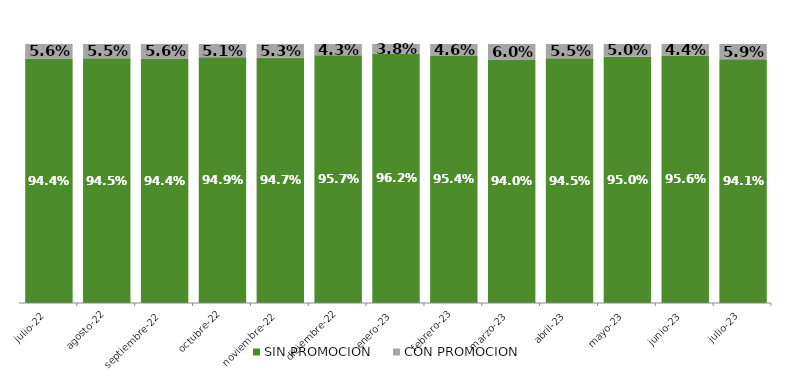
| Category | SIN PROMOCION   | CON PROMOCION   |
|---|---|---|
| 2022-07-01 | 0.944 | 0.056 |
| 2022-08-01 | 0.945 | 0.055 |
| 2022-09-01 | 0.944 | 0.056 |
| 2022-10-01 | 0.949 | 0.051 |
| 2022-11-01 | 0.947 | 0.053 |
| 2022-12-01 | 0.957 | 0.043 |
| 2023-01-01 | 0.962 | 0.038 |
| 2023-02-01 | 0.954 | 0.046 |
| 2023-03-01 | 0.94 | 0.06 |
| 2023-04-01 | 0.945 | 0.055 |
| 2023-05-01 | 0.95 | 0.05 |
| 2023-06-01 | 0.956 | 0.044 |
| 2023-07-01 | 0.941 | 0.059 |